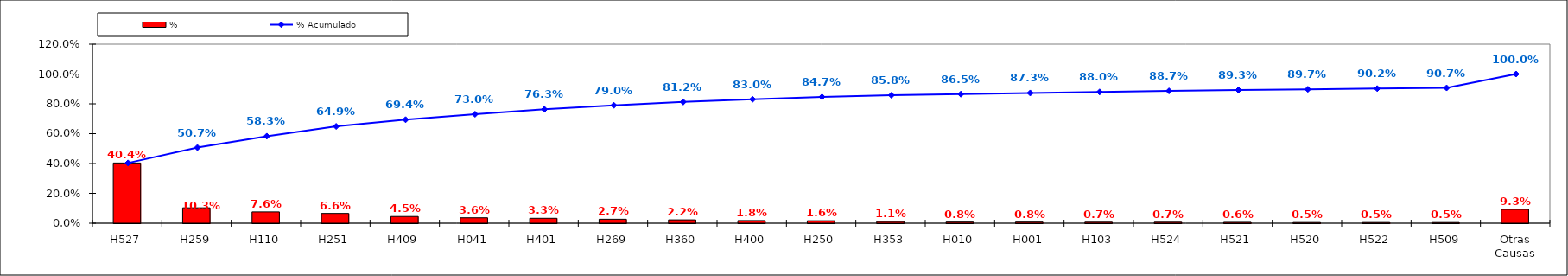
| Category | % |
|---|---|
| H527 | 0.404 |
| H259 | 0.103 |
| H110 | 0.076 |
| H251 | 0.066 |
| H409 | 0.045 |
| H041 | 0.036 |
| H401 | 0.033 |
| H269 | 0.027 |
| H360 | 0.022 |
| H400 | 0.018 |
| H250 | 0.016 |
| H353 | 0.011 |
| H010 | 0.008 |
| H001 | 0.008 |
| H103 | 0.007 |
| H524 | 0.007 |
| H521 | 0.006 |
| H520 | 0.005 |
| H522 | 0.005 |
| H509 | 0.005 |
| Otras Causas | 0.093 |